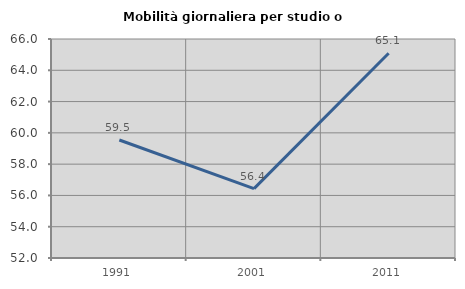
| Category | Mobilità giornaliera per studio o lavoro |
|---|---|
| 1991.0 | 59.544 |
| 2001.0 | 56.433 |
| 2011.0 | 65.087 |